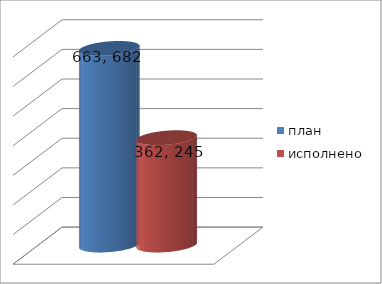
| Category | план | исполнено |
|---|---|---|
| 0 | 663682189.26 | 362245820.39 |